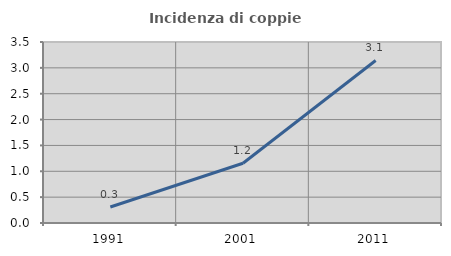
| Category | Incidenza di coppie miste |
|---|---|
| 1991.0 | 0.309 |
| 2001.0 | 1.156 |
| 2011.0 | 3.143 |